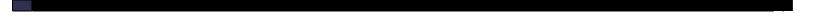
| Category | Series 0 | Series 1 | Series 2 | Series 3 |
|---|---|---|---|---|
| 0 | 2.61 | 97.39 | 2.61 | 97.39 |